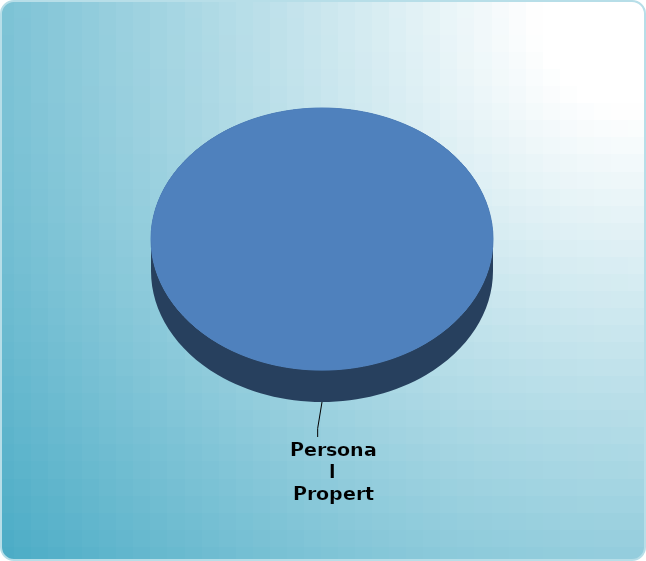
| Category | Series 0 |
|---|---|
| Cash | 0 |
| Bonds | 0 |
| Muni Bond | 0 |
| Hybrid bond | 0 |
| Value | 0 |
| Growth | 0 |
| Small-Cap | 0 |
| Tangibles | 0 |
| International | 0 |
| Personal Property | 0 |
| Miscellaneous | 0 |